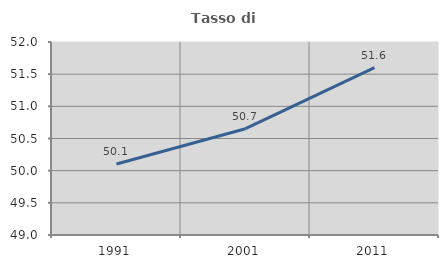
| Category | Tasso di occupazione   |
|---|---|
| 1991.0 | 50.104 |
| 2001.0 | 50.652 |
| 2011.0 | 51.603 |